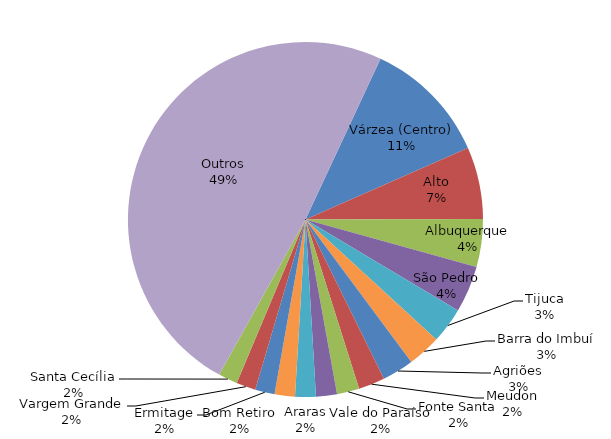
| Category | Quantidade |
|---|---|
| Várzea (Centro) | 4788 |
| Alto | 2738 |
| Albuquerque | 1822 |
| São Pedro | 1778 |
| Tijuca | 1364 |
| Barra do Imbuí | 1263 |
| Agriões | 1204 |
| Meudon | 1002 |
| Fonte Santa | 851 |
| Vale do Paraíso | 798 |
| Araras | 788 |
| Bom Retiro | 775 |
| Ermitage | 742 |
| Vargem Grande | 737 |
| Santa Cecília | 729 |
| Outros | 20430 |